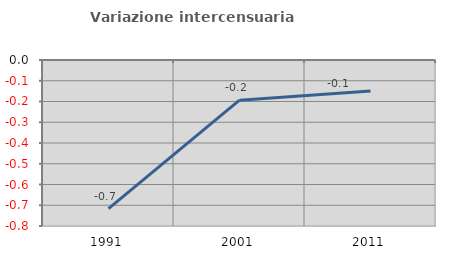
| Category | Variazione intercensuaria annua |
|---|---|
| 1991.0 | -0.716 |
| 2001.0 | -0.194 |
| 2011.0 | -0.149 |